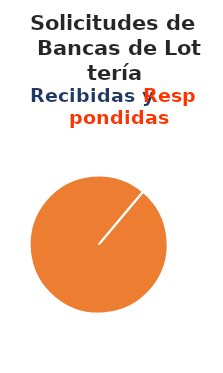
| Category | Series 0 |
|---|---|
| 0 | 0 |
| 1 | 84 |